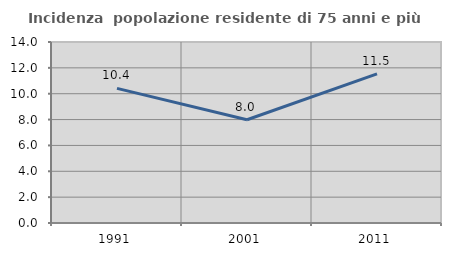
| Category | Incidenza  popolazione residente di 75 anni e più |
|---|---|
| 1991.0 | 10.411 |
| 2001.0 | 7.984 |
| 2011.0 | 11.538 |